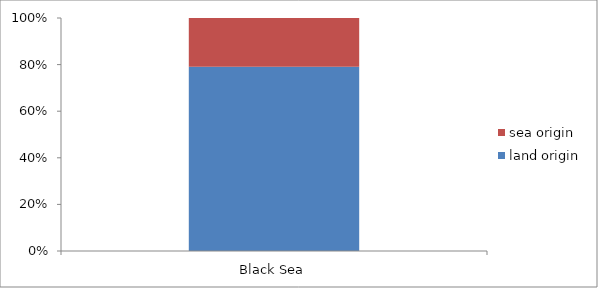
| Category | land origin | sea origin |
|---|---|---|
| Black Sea | 24230.5 | 6424 |